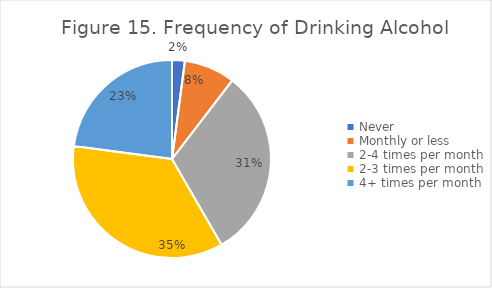
| Category | Series 0 |
|---|---|
| Never | 0.021 |
| Monthly or less | 0.083 |
| 2-4 times per month | 0.312 |
| 2-3 times per month | 0.354 |
| 4+ times per month | 0.229 |